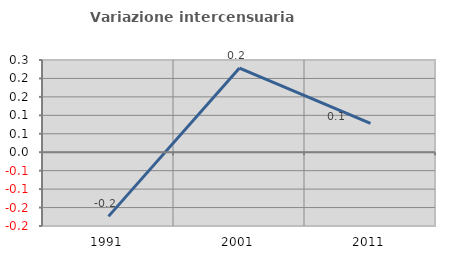
| Category | Variazione intercensuaria annua |
|---|---|
| 1991.0 | -0.174 |
| 2001.0 | 0.228 |
| 2011.0 | 0.079 |